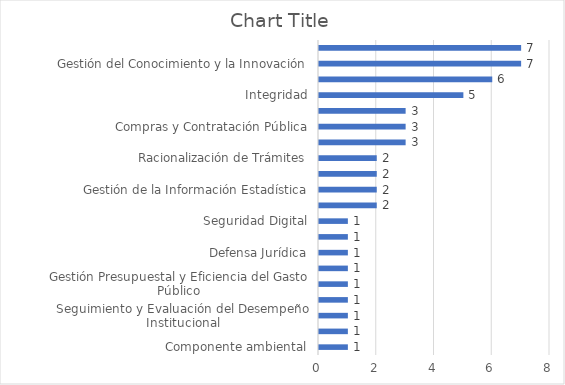
| Category | Series 0 |
|---|---|
| Componente ambiental | 1 |
| Control Interno | 1 |
| Seguimiento y Evaluación del Desempeño Institucional | 1 |
| Planeación Institucional | 1 |
| Gestión Presupuestal y Eficiencia del Gasto Público | 1 |
| Fortalecimiento Organizacional y Simplificación de Procesos | 1 |
| Defensa Jurídica | 1 |
| Mejora Normativa | 1 |
| Seguridad Digital | 1 |
| Transparencia, Acceso a la Información Pública y Lucha Contra la Corrupción | 2 |
| Gestión de la Información Estadística | 2 |
| Participación Ciudadana en la Gestión Pública | 2 |
| Racionalización de Trámites | 2 |
| Archivos y Gestión Documental | 3 |
| Compras y Contratación Pública | 3 |
| Gestión Estratégica del Talento Humano | 3 |
| Integridad | 5 |
| Servicio al Ciudadano | 6 |
| Gestión del Conocimiento y la Innovación | 7 |
| Gobierno Digital | 7 |